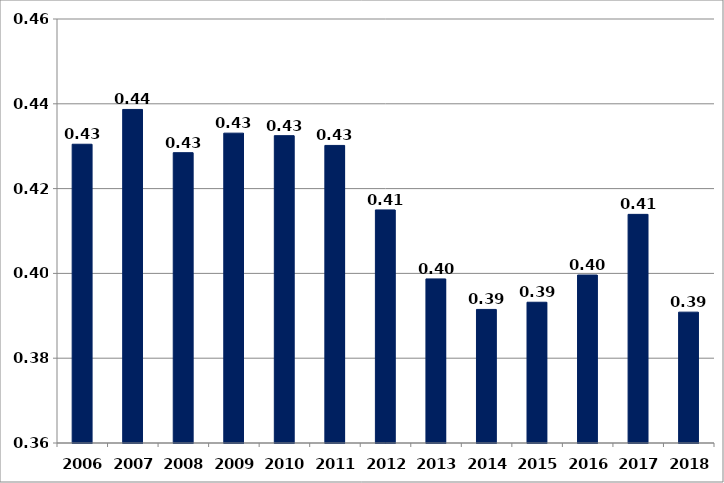
| Category | მთლიანი შემოსავლების მიხედვით1 |
|---|---|
| 2006.0 | 0.43 |
| 2007.0 | 0.439 |
| 2008.0 | 0.428 |
| 2009.0 | 0.433 |
| 2010.0 | 0.432 |
| 2011.0 | 0.43 |
| 2012.0 | 0.415 |
| 2013.0 | 0.399 |
| 2014.0 | 0.392 |
| 2015.0 | 0.393 |
| 2016.0 | 0.4 |
| 2017.0 | 0.414 |
| 2018.0 | 0.391 |